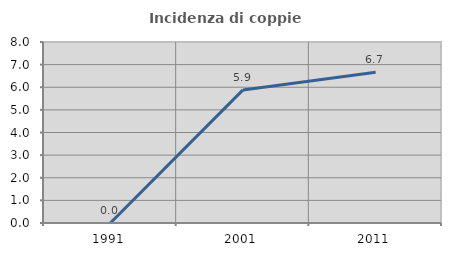
| Category | Incidenza di coppie miste |
|---|---|
| 1991.0 | 0 |
| 2001.0 | 5.882 |
| 2011.0 | 6.667 |